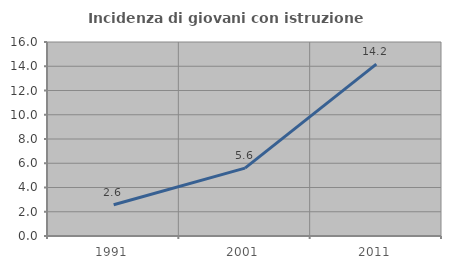
| Category | Incidenza di giovani con istruzione universitaria |
|---|---|
| 1991.0 | 2.581 |
| 2001.0 | 5.599 |
| 2011.0 | 14.179 |